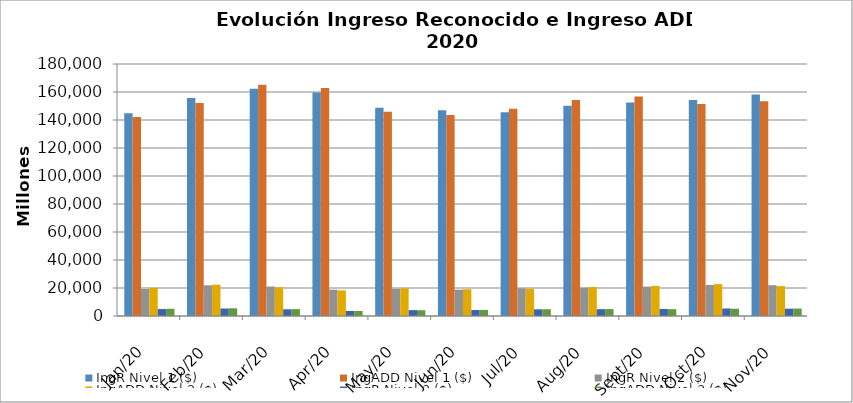
| Category | IngR Nivel 1 ($) | IngADD Nivel 1 ($) | IngR Nivel 2 ($) | IngADD Nivel 2 ($) | IngR Nivel 3 ($) | IngADD Nivel 3 ($) |
|---|---|---|---|---|---|---|
| 2020-01-01 | 144814631868 | 142127972275 | 19270134450 | 20112203969 | 4973097398 | 5154743577 |
| 2020-02-01 | 155627601820 | 152172164662 | 21919513398 | 22341048562 | 5345605587 | 5520564414 |
| 2020-03-01 | 162263747113 | 165112165351 | 21051159356 | 20528559264 | 4795916922 | 4931533869 |
| 2020-04-01 | 159617614149 | 162944009545 | 18798696607 | 18313245268 | 3604738967 | 3569073150 |
| 2020-05-01 | 148768824719 | 145883323668 | 19438289165 | 19780335896 | 4205886020 | 4122685634 |
| 2020-06-01 | 147017024611 | 143569387389 | 18779135434 | 19120632203 | 4307545157 | 4362479868 |
| 2020-07-01 | 145595553493 | 148109993282 | 19821410077 | 19478073605 | 4767463480 | 4823268257 |
| 2020-08-01 | 150125110906 | 154331799651 | 20167065455 | 20674322653 | 4882277300 | 4954506615 |
| 2020-09-01 | 152525461878 | 156774957077 | 20956918203 | 21516569838 | 5053117469 | 4866471878 |
| 2020-10-01 | 154269034734 | 151381150893 | 22184641708 | 22775979157 | 5371706537 | 5196291707 |
| 2020-11-01 | 158161527360 | 153465293355 | 21998413748 | 21352589825 | 5229684979 | 5314918222 |